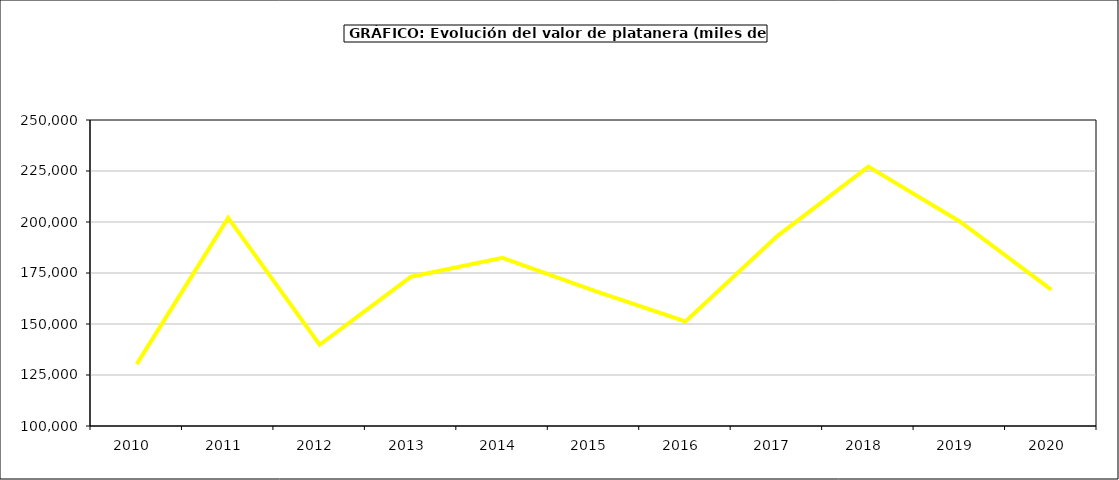
| Category | valor platanera |
|---|---|
| 2010.0 | 130319.145 |
| 2011.0 | 202014.747 |
| 2012.0 | 139816.382 |
| 2013.0 | 173165.464 |
| 2014.0 | 182466.749 |
| 2015.0 | 166392 |
| 2016.0 | 151266 |
| 2017.0 | 192961.354 |
| 2018.0 | 227178.133 |
| 2019.0 | 200278.061 |
| 2020.0 | 166839.182 |